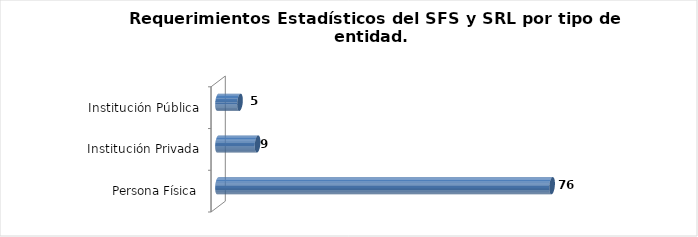
| Category | Total |
|---|---|
| Persona Física | 76 |
| Institución Privada | 9 |
| Institución Pública | 5 |